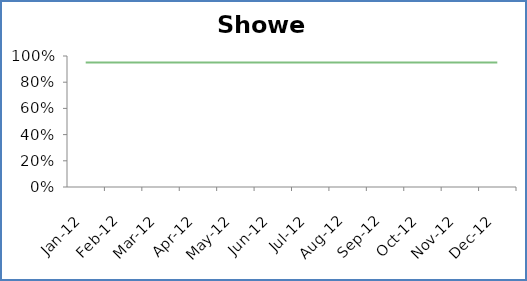
| Category | Shower | Median | Goal |
|---|---|---|---|
| 2012-01-01 |  | 0 | 0.95 |
| 2012-02-01 |  | 0 | 0.95 |
| 2012-03-01 |  | 0 | 0.95 |
| 2012-04-01 |  | 0 | 0.95 |
| 2012-05-01 |  | 0 | 0.95 |
| 2012-06-01 |  | 0 | 0.95 |
| 2012-07-01 |  | 0 | 0.95 |
| 2012-08-01 |  | 0 | 0.95 |
| 2012-09-01 |  | 0 | 0.95 |
| 2012-10-01 |  | 0 | 0.95 |
| 2012-11-01 |  | 0 | 0.95 |
| 2012-12-01 |  | 0 | 0.95 |